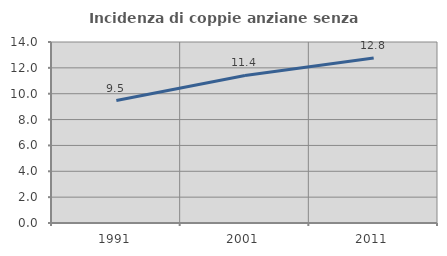
| Category | Incidenza di coppie anziane senza figli  |
|---|---|
| 1991.0 | 9.471 |
| 2001.0 | 11.416 |
| 2011.0 | 12.77 |